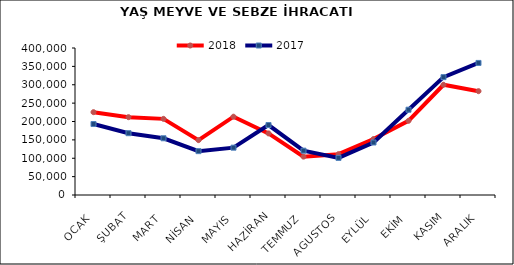
| Category | 2018 | 2017 |
|---|---|---|
| OCAK | 225383.315 | 193141.911 |
| ŞUBAT | 211800.016 | 168162.278 |
| MART | 207215.232 | 154358.604 |
| NİSAN | 149359.976 | 119338.095 |
| MAYIS | 213056.615 | 128812.809 |
| HAZİRAN | 167647.675 | 190392.677 |
| TEMMUZ | 104399.392 | 120607.995 |
| AGUSTOS | 111086.599 | 100994.308 |
| EYLÜL | 152281.889 | 142896.146 |
| EKİM | 201927.422 | 232093.077 |
| KASIM | 299996.402 | 320663.916 |
| ARALIK | 282516.089 | 359363.734 |